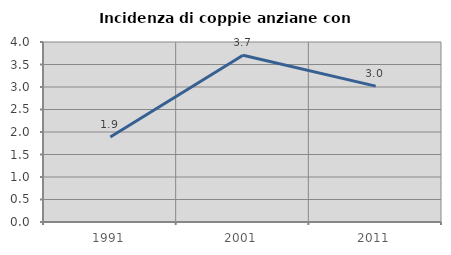
| Category | Incidenza di coppie anziane con figli |
|---|---|
| 1991.0 | 1.887 |
| 2001.0 | 3.704 |
| 2011.0 | 3.019 |